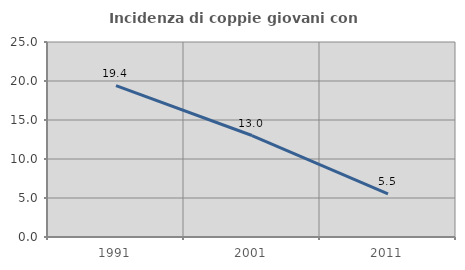
| Category | Incidenza di coppie giovani con figli |
|---|---|
| 1991.0 | 19.412 |
| 2001.0 | 13.01 |
| 2011.0 | 5.532 |